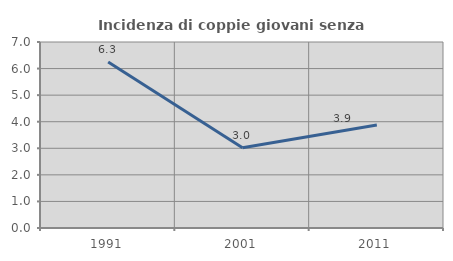
| Category | Incidenza di coppie giovani senza figli |
|---|---|
| 1991.0 | 6.25 |
| 2001.0 | 3.022 |
| 2011.0 | 3.874 |